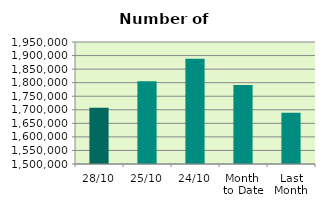
| Category | Series 0 |
|---|---|
| 28/10 | 1707892 |
| 25/10 | 1805176 |
| 24/10 | 1887910 |
| Month 
to Date | 1791771.7 |
| Last
Month | 1689477.048 |